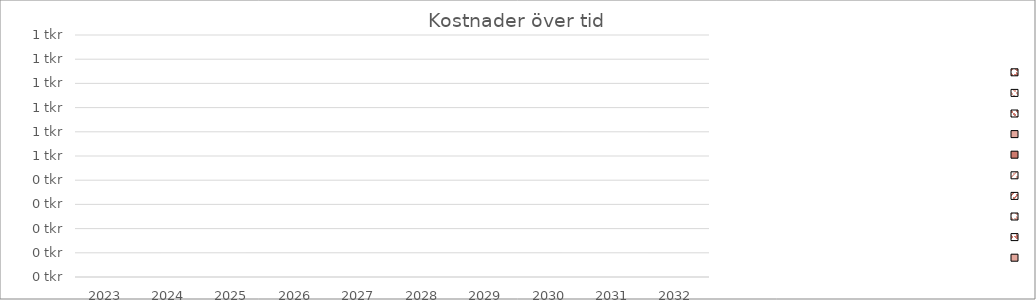
| Category | Series 14 | Series 13 | Series 12 | Series 11 | Series 10 | Series 9 | Series 8 | Series 7 | Series 6 | Series 5 |
|---|---|---|---|---|---|---|---|---|---|---|
| 2023.0 | 0 | 0 | 0 | 0 | 0 | 0 | 0 | 0 | 0 | 0 |
| 2024.0 | 0 | 0 | 0 | 0 | 0 | 0 | 0 | 0 | 0 | 0 |
| 2025.0 | 0 | 0 | 0 | 0 | 0 | 0 | 0 | 0 | 0 | 0 |
| 2026.0 | 0 | 0 | 0 | 0 | 0 | 0 | 0 | 0 | 0 | 0 |
| 2027.0 | 0 | 0 | 0 | 0 | 0 | 0 | 0 | 0 | 0 | 0 |
| 2028.0 | 0 | 0 | 0 | 0 | 0 | 0 | 0 | 0 | 0 | 0 |
| 2029.0 | 0 | 0 | 0 | 0 | 0 | 0 | 0 | 0 | 0 | 0 |
| 2030.0 | 0 | 0 | 0 | 0 | 0 | 0 | 0 | 0 | 0 | 0 |
| 2031.0 | 0 | 0 | 0 | 0 | 0 | 0 | 0 | 0 | 0 | 0 |
| 2032.0 | 0 | 0 | 0 | 0 | 0 | 0 | 0 | 0 | 0 | 0 |